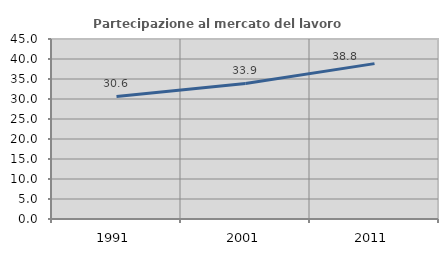
| Category | Partecipazione al mercato del lavoro  femminile |
|---|---|
| 1991.0 | 30.637 |
| 2001.0 | 33.902 |
| 2011.0 | 38.843 |